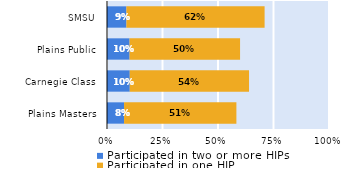
| Category | Participated in two or more HIPs | Participated in one HIP |
|---|---|---|
| Plains Masters | 0.077 | 0.506 |
| Carnegie Class | 0.103 | 0.537 |
| Plains Public | 0.102 | 0.498 |
| SMSU | 0.087 | 0.622 |